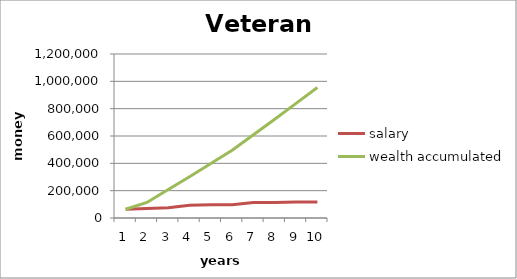
| Category | salary | wealth accumulated |
|---|---|---|
| 0 | 63395 | 63695 |
| 1 | 69995 | 113690 |
| 2 | 75276 | 208967 |
| 3 | 92829 | 301796 |
| 4 | 97192 | 398989 |
| 5 | 97192 | 496182 |
| 6 | 113227 | 609410 |
| 7 | 113227 | 722637 |
| 8 | 116180 | 838817 |
| 9 | 116180 | 954998 |